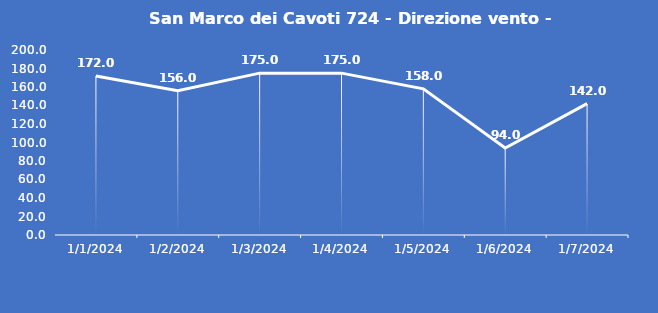
| Category | San Marco dei Cavoti 724 - Direzione vento - Grezzo (°N) |
|---|---|
| 1/1/24 | 172 |
| 1/2/24 | 156 |
| 1/3/24 | 175 |
| 1/4/24 | 175 |
| 1/5/24 | 158 |
| 1/6/24 | 94 |
| 1/7/24 | 142 |